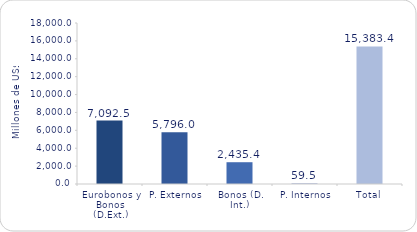
| Category | Series 1 |
|---|---|
| Eurobonos y Bonos (D.Ext.) | 7092.5 |
| P. Externos | 5796 |
| Bonos (D. Int.) | 2435.4 |
| P. Internos | 59.5 |
| Total | 15383.4 |